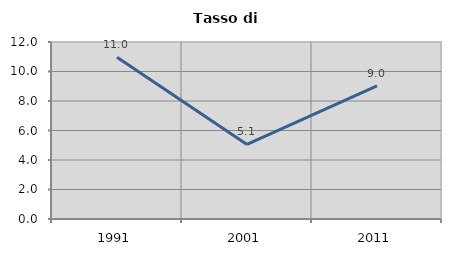
| Category | Tasso di disoccupazione   |
|---|---|
| 1991.0 | 10.964 |
| 2001.0 | 5.056 |
| 2011.0 | 9.033 |